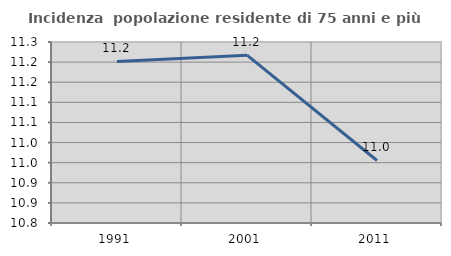
| Category | Incidenza  popolazione residente di 75 anni e più |
|---|---|
| 1991.0 | 11.202 |
| 2001.0 | 11.217 |
| 2011.0 | 10.955 |